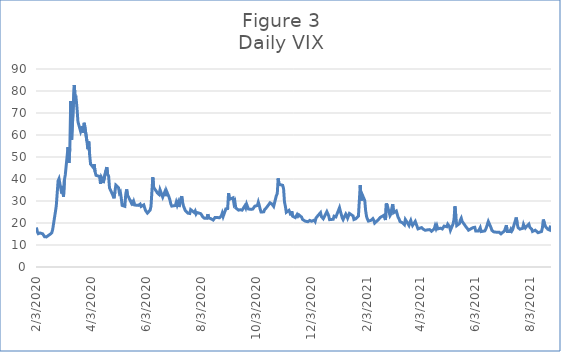
| Category | Series 0 |
|---|---|
| 2/3/20 | 17.97 |
| 2/4/20 | 16.05 |
| 2/5/20 | 15.15 |
| 2/6/20 | 14.96 |
| 2/7/20 | 15.47 |
| 2/10/20 | 15.04 |
| 2/11/20 | 15.18 |
| 2/12/20 | 13.74 |
| 2/13/20 | 14.15 |
| 2/14/20 | 13.68 |
| 2/18/20 | 14.83 |
| 2/19/20 | 14.38 |
| 2/20/20 | 15.56 |
| 2/21/20 | 17.08 |
| 2/24/20 | 25.03 |
| 2/25/20 | 27.85 |
| 2/26/20 | 27.56 |
| 2/27/20 | 39.16 |
| 2/28/20 | 40.11 |
| 3/2/20 | 33.42 |
| 3/3/20 | 36.82 |
| 3/4/20 | 31.99 |
| 3/5/20 | 39.62 |
| 3/6/20 | 41.94 |
| 3/9/20 | 54.46 |
| 3/10/20 | 47.3 |
| 3/11/20 | 53.9 |
| 3/12/20 | 75.47 |
| 3/13/20 | 57.83 |
| 3/16/20 | 82.69 |
| 3/17/20 | 75.91 |
| 3/18/20 | 76.45 |
| 3/19/20 | 72 |
| 3/20/20 | 66.04 |
| 3/23/20 | 61.59 |
| 3/24/20 | 61.67 |
| 3/25/20 | 63.95 |
| 3/26/20 | 61 |
| 3/27/20 | 65.54 |
| 3/30/20 | 57.08 |
| 3/31/20 | 53.54 |
| 4/1/20 | 57.06 |
| 4/2/20 | 50.91 |
| 4/3/20 | 46.8 |
| 4/6/20 | 45.24 |
| 4/7/20 | 46.7 |
| 4/8/20 | 43.35 |
| 4/9/20 | 41.67 |
| 4/13/20 | 41.17 |
| 4/14/20 | 37.76 |
| 4/15/20 | 40.84 |
| 4/16/20 | 40.11 |
| 4/17/20 | 38.15 |
| 4/20/20 | 43.83 |
| 4/21/20 | 45.41 |
| 4/22/20 | 41.98 |
| 4/23/20 | 41.38 |
| 4/24/20 | 35.93 |
| 4/27/20 | 33.29 |
| 4/28/20 | 33.57 |
| 4/29/20 | 31.23 |
| 4/30/20 | 34.15 |
| 5/1/20 | 37.19 |
| 5/4/20 | 35.97 |
| 5/5/20 | 33.61 |
| 5/6/20 | 34.12 |
| 5/7/20 | 31.44 |
| 5/8/20 | 27.98 |
| 5/11/20 | 27.57 |
| 5/12/20 | 33.04 |
| 5/13/20 | 35.28 |
| 5/14/20 | 32.61 |
| 5/15/20 | 31.89 |
| 5/18/20 | 29.3 |
| 5/19/20 | 30.53 |
| 5/20/20 | 27.99 |
| 5/21/20 | 29.53 |
| 5/22/20 | 28.16 |
| 5/26/20 | 28.01 |
| 5/27/20 | 27.62 |
| 5/28/20 | 28.59 |
| 5/29/20 | 27.51 |
| 6/1/20 | 28.23 |
| 6/2/20 | 26.84 |
| 6/3/20 | 25.66 |
| 6/4/20 | 25.81 |
| 6/5/20 | 24.52 |
| 6/8/20 | 25.81 |
| 6/9/20 | 27.57 |
| 6/10/20 | 27.57 |
| 6/11/20 | 40.79 |
| 6/12/20 | 36.09 |
| 6/15/20 | 34.4 |
| 6/16/20 | 33.67 |
| 6/17/20 | 33.47 |
| 6/18/20 | 32.94 |
| 6/19/20 | 35.12 |
| 6/22/20 | 31.77 |
| 6/23/20 | 31.37 |
| 6/24/20 | 33.84 |
| 6/25/20 | 32.22 |
| 6/26/20 | 34.73 |
| 6/29/20 | 31.78 |
| 6/30/20 | 30.43 |
| 7/1/20 | 28.62 |
| 7/2/20 | 27.68 |
| 7/6/20 | 27.94 |
| 7/7/20 | 29.43 |
| 7/8/20 | 28.08 |
| 7/9/20 | 29.26 |
| 7/10/20 | 27.29 |
| 7/13/20 | 32.19 |
| 7/14/20 | 29.52 |
| 7/15/20 | 27.76 |
| 7/16/20 | 28 |
| 7/17/20 | 25.68 |
| 7/20/20 | 24.46 |
| 7/21/20 | 24.84 |
| 7/22/20 | 24.32 |
| 7/23/20 | 26.08 |
| 7/24/20 | 25.84 |
| 7/27/20 | 24.74 |
| 7/28/20 | 25.44 |
| 7/29/20 | 24.1 |
| 7/30/20 | 24.76 |
| 7/31/20 | 24.46 |
| 8/3/20 | 24.28 |
| 8/4/20 | 23.76 |
| 8/5/20 | 22.99 |
| 8/6/20 | 22.65 |
| 8/7/20 | 22.21 |
| 8/10/20 | 22.13 |
| 8/11/20 | 24.03 |
| 8/12/20 | 22.28 |
| 8/13/20 | 22.13 |
| 8/14/20 | 22.05 |
| 8/17/20 | 21.35 |
| 8/18/20 | 21.51 |
| 8/19/20 | 22.54 |
| 8/20/20 | 22.72 |
| 8/21/20 | 22.54 |
| 8/24/20 | 22.37 |
| 8/25/20 | 22.03 |
| 8/26/20 | 23.27 |
| 8/27/20 | 24.47 |
| 8/28/20 | 22.96 |
| 8/31/20 | 26.41 |
| 9/1/20 | 26.12 |
| 9/2/20 | 26.57 |
| 9/3/20 | 33.6 |
| 9/4/20 | 30.75 |
| 9/8/20 | 31.46 |
| 9/9/20 | 28.81 |
| 9/10/20 | 29.71 |
| 9/11/20 | 26.87 |
| 9/14/20 | 25.85 |
| 9/15/20 | 25.59 |
| 9/16/20 | 26.04 |
| 9/17/20 | 26.46 |
| 9/18/20 | 25.83 |
| 9/21/20 | 27.78 |
| 9/22/20 | 26.86 |
| 9/23/20 | 28.58 |
| 9/24/20 | 28.51 |
| 9/25/20 | 26.38 |
| 9/28/20 | 26.19 |
| 9/29/20 | 26.27 |
| 9/30/20 | 26.37 |
| 10/1/20 | 26.7 |
| 10/2/20 | 27.63 |
| 10/5/20 | 27.96 |
| 10/6/20 | 29.48 |
| 10/7/20 | 28.06 |
| 10/8/20 | 26.36 |
| 10/9/20 | 25 |
| 10/12/20 | 25.07 |
| 10/13/20 | 26.07 |
| 10/14/20 | 26.4 |
| 10/15/20 | 26.97 |
| 10/16/20 | 27.41 |
| 10/19/20 | 29.18 |
| 10/20/20 | 29.35 |
| 10/21/20 | 28.65 |
| 10/22/20 | 28.11 |
| 10/23/20 | 27.55 |
| 10/26/20 | 32.46 |
| 10/27/20 | 33.35 |
| 10/28/20 | 40.28 |
| 10/29/20 | 37.59 |
| 10/30/20 | 38.02 |
| 11/2/20 | 37.13 |
| 11/3/20 | 35.55 |
| 11/4/20 | 29.57 |
| 11/5/20 | 27.58 |
| 11/6/20 | 24.86 |
| 11/9/20 | 25.75 |
| 11/10/20 | 24.8 |
| 11/11/20 | 23.45 |
| 11/12/20 | 25.35 |
| 11/13/20 | 23.1 |
| 11/16/20 | 22.45 |
| 11/17/20 | 22.71 |
| 11/18/20 | 23.84 |
| 11/19/20 | 23.11 |
| 11/20/20 | 23.7 |
| 11/23/20 | 22.66 |
| 11/24/20 | 21.64 |
| 11/25/20 | 21.25 |
| 11/27/20 | 20.84 |
| 11/30/20 | 20.57 |
| 12/1/20 | 20.77 |
| 12/2/20 | 21.17 |
| 12/3/20 | 21.28 |
| 12/4/20 | 20.79 |
| 12/7/20 | 21.3 |
| 12/8/20 | 20.68 |
| 12/9/20 | 22.27 |
| 12/10/20 | 22.52 |
| 12/11/20 | 23.31 |
| 12/14/20 | 24.72 |
| 12/15/20 | 22.89 |
| 12/16/20 | 22.5 |
| 12/17/20 | 21.93 |
| 12/18/20 | 21.57 |
| 12/21/20 | 25.16 |
| 12/22/20 | 24.23 |
| 12/23/20 | 23.31 |
| 12/24/20 | 21.53 |
| 12/28/20 | 21.7 |
| 12/29/20 | 23.08 |
| 12/30/20 | 22.77 |
| 12/31/20 | 22.75 |
| 1/4/21 | 26.97 |
| 1/5/21 | 25.34 |
| 1/6/21 | 25.07 |
| 1/7/21 | 22.37 |
| 1/8/21 | 21.56 |
| 1/11/21 | 24.08 |
| 1/12/21 | 23.33 |
| 1/13/21 | 22.21 |
| 1/14/21 | 23.25 |
| 1/15/21 | 24.34 |
| 1/19/21 | 23.24 |
| 1/20/21 | 21.58 |
| 1/21/21 | 21.32 |
| 1/22/21 | 21.91 |
| 1/25/21 | 23.19 |
| 1/26/21 | 23.02 |
| 1/27/21 | 37.21 |
| 1/28/21 | 30.21 |
| 1/29/21 | 33.09 |
| 2/1/21 | 30.24 |
| 2/2/21 | 25.56 |
| 2/3/21 | 22.91 |
| 2/4/21 | 21.77 |
| 2/5/21 | 20.87 |
| 2/8/21 | 21.24 |
| 2/9/21 | 21.63 |
| 2/10/21 | 21.99 |
| 2/11/21 | 21.25 |
| 2/12/21 | 19.97 |
| 2/16/21 | 21.46 |
| 2/17/21 | 21.5 |
| 2/18/21 | 22.49 |
| 2/19/21 | 22.05 |
| 2/22/21 | 23.45 |
| 2/23/21 | 23.11 |
| 2/24/21 | 21.34 |
| 2/25/21 | 28.89 |
| 2/26/21 | 27.95 |
| 3/1/21 | 23.35 |
| 3/2/21 | 24.1 |
| 3/3/21 | 26.67 |
| 3/4/21 | 28.57 |
| 3/5/21 | 24.66 |
| 3/8/21 | 25.47 |
| 3/9/21 | 24.03 |
| 3/10/21 | 22.56 |
| 3/11/21 | 21.91 |
| 3/12/21 | 20.69 |
| 3/15/21 | 20.03 |
| 3/16/21 | 19.79 |
| 3/17/21 | 19.23 |
| 3/18/21 | 21.58 |
| 3/19/21 | 20.95 |
| 3/22/21 | 18.88 |
| 3/23/21 | 20.3 |
| 3/24/21 | 21.2 |
| 3/25/21 | 19.81 |
| 3/26/21 | 18.86 |
| 3/29/21 | 20.74 |
| 3/30/21 | 19.61 |
| 3/31/21 | 19.4 |
| 4/1/21 | 17.33 |
| 4/5/21 | 17.91 |
| 4/6/21 | 18.12 |
| 4/7/21 | 17.16 |
| 4/8/21 | 16.95 |
| 4/9/21 | 16.69 |
| 4/12/21 | 16.91 |
| 4/13/21 | 16.65 |
| 4/14/21 | 16.99 |
| 4/15/21 | 16.57 |
| 4/16/21 | 16.25 |
| 4/19/21 | 17.29 |
| 4/20/21 | 18.68 |
| 4/21/21 | 17.5 |
| 4/22/21 | 18.71 |
| 4/23/21 | 17.33 |
| 4/26/21 | 17.64 |
| 4/27/21 | 17.56 |
| 4/28/21 | 17.28 |
| 4/29/21 | 17.61 |
| 4/30/21 | 18.61 |
| 5/3/21 | 18.31 |
| 5/4/21 | 19.48 |
| 5/5/21 | 19.15 |
| 5/6/21 | 18.39 |
| 5/7/21 | 16.69 |
| 5/10/21 | 19.66 |
| 5/11/21 | 21.84 |
| 5/12/21 | 27.59 |
| 5/13/21 | 23.13 |
| 5/14/21 | 18.81 |
| 5/17/21 | 19.72 |
| 5/18/21 | 21.34 |
| 5/19/21 | 22.18 |
| 5/20/21 | 20.67 |
| 5/21/21 | 20.15 |
| 5/24/21 | 18.4 |
| 5/25/21 | 18.84 |
| 5/26/21 | 17.36 |
| 5/27/21 | 16.74 |
| 5/28/21 | 16.76 |
| 6/1/21 | 17.9 |
| 6/2/21 | 17.48 |
| 6/3/21 | 18.04 |
| 6/4/21 | 16.42 |
| 6/7/21 | 16.42 |
| 6/8/21 | 17.07 |
| 6/9/21 | 17.89 |
| 6/10/21 | 16.1 |
| 6/11/21 | 15.65 |
| 6/14/21 | 16.39 |
| 6/15/21 | 17.02 |
| 6/16/21 | 18.15 |
| 6/17/21 | 17.75 |
| 6/18/21 | 20.7 |
| 6/21/21 | 17.89 |
| 6/22/21 | 16.66 |
| 6/23/21 | 16.32 |
| 6/24/21 | 15.97 |
| 6/25/21 | 15.62 |
| 6/28/21 | 15.76 |
| 6/29/21 | 16.02 |
| 6/30/21 | 15.83 |
| 7/1/21 | 15.48 |
| 7/2/21 | 15.07 |
| 7/6/21 | 16.44 |
| 7/7/21 | 16.2 |
| 7/8/21 | 19 |
| 7/9/21 | 16.18 |
| 7/12/21 | 16.17 |
| 7/13/21 | 17.12 |
| 7/14/21 | 16.33 |
| 7/15/21 | 17.01 |
| 7/16/21 | 18.45 |
| 7/19/21 | 22.5 |
| 7/20/21 | 19.73 |
| 7/21/21 | 17.91 |
| 7/22/21 | 17.69 |
| 7/23/21 | 17.2 |
| 7/26/21 | 17.58 |
| 7/27/21 | 19.36 |
| 7/28/21 | 18.31 |
| 7/29/21 | 17.7 |
| 7/30/21 | 18.24 |
| 8/2/21 | 19.46 |
| 8/3/21 | 18.04 |
| 8/4/21 | 17.97 |
| 8/5/21 | 17.28 |
| 8/6/21 | 16.15 |
| 8/9/21 | 16.72 |
| 8/10/21 | 16.79 |
| 8/11/21 | 16.06 |
| 8/12/21 | 15.59 |
| 8/13/21 | 15.45 |
| 8/16/21 | 16.12 |
| 8/17/21 | 17.91 |
| 8/18/21 | 21.57 |
| 8/19/21 | 21.67 |
| 8/20/21 | 18.56 |
| 8/23/21 | 17.15 |
| 8/24/21 | 17.22 |
| 8/25/21 | 16.79 |
| 8/26/21 | 18.84 |